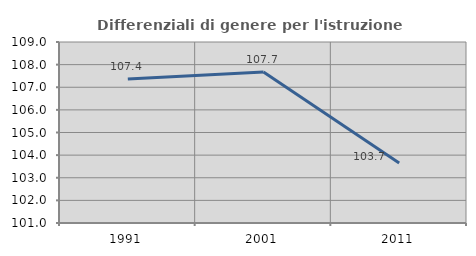
| Category | Differenziali di genere per l'istruzione superiore |
|---|---|
| 1991.0 | 107.365 |
| 2001.0 | 107.675 |
| 2011.0 | 103.651 |